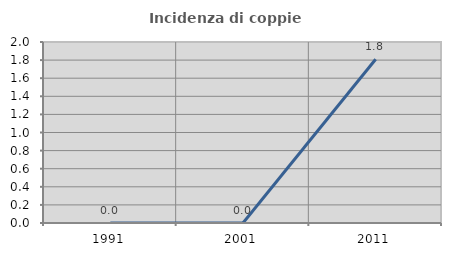
| Category | Incidenza di coppie miste |
|---|---|
| 1991.0 | 0 |
| 2001.0 | 0 |
| 2011.0 | 1.81 |